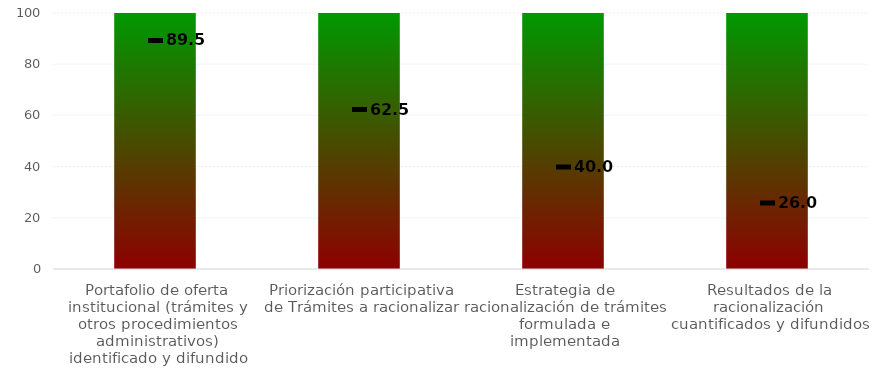
| Category | Rangos |
|---|---|
| Portafolio de oferta institucional (trámites y otros procedimientos administrativos) identificado y difundido | 100 |
| Priorización participativa de Trámites a racionalizar | 100 |
| Estrategia de racionalización de trámites formulada e implementada | 100 |
| Resultados de la racionalización cuantificados y difundidos | 100 |